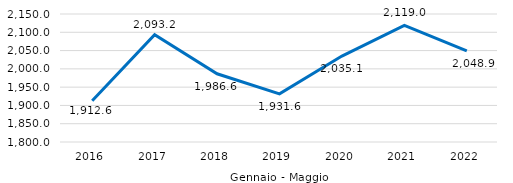
| Category | Series 0 |
|---|---|
| 0 | 1912.562 |
| 1 | 2093.239 |
| 2 | 1986.553 |
| 3 | 1931.629 |
| 4 | 2035.076 |
| 5 | 2118.967 |
| 6 | 2048.871 |